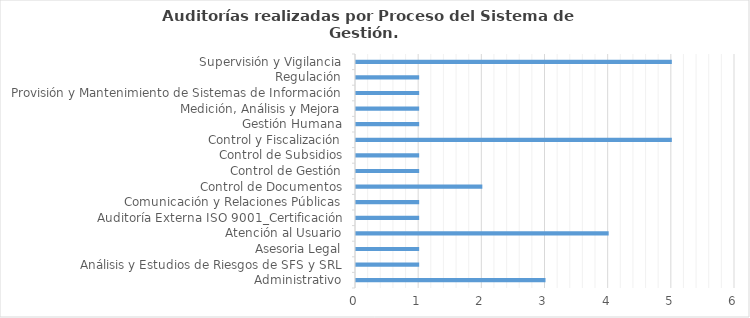
| Category | Total |
|---|---|
| Administrativo | 3 |
| Análisis y Estudios de Riesgos de SFS y SRL | 1 |
| Asesoria Legal | 1 |
| Atención al Usuario | 4 |
| Auditoría Externa ISO 9001_Certificación | 1 |
| Comunicación y Relaciones Públicas | 1 |
| Control de Documentos | 2 |
| Control de Gestión | 1 |
| Control de Subsidios | 1 |
| Control y Fiscalización | 5 |
| Gestión Humana | 1 |
| Medición, Análisis y Mejora | 1 |
| Provisión y Mantenimiento de Sistemas de Información | 1 |
| Regulación | 1 |
| Supervisión y Vigilancia | 5 |